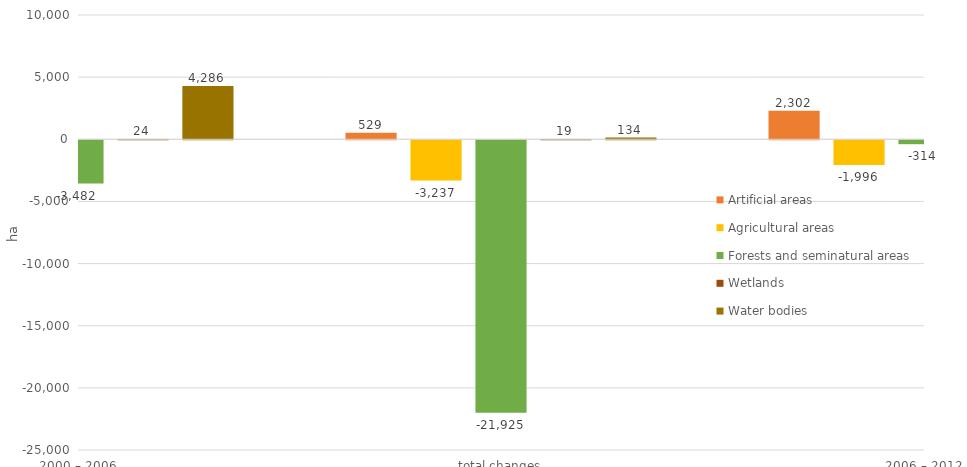
| Category | Artificial areas | Agricultural areas | Forests and seminatural areas | Wetlands | Water bodies |
|---|---|---|---|---|---|
| 0 | 2629 | -3658 | -3482 | 24 | 4286 |
| 1 | 528.917 | -3236.65 | -21924.837 | 19.048 | 133.876 |
| 2 | 2301.97 | -1995.78 | -314.09 | 31.86 | -23.96 |